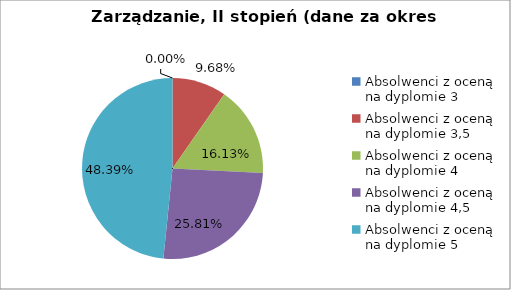
| Category | Series 0 |
|---|---|
| Absolwenci z oceną na dyplomie 3 | 0 |
| Absolwenci z oceną na dyplomie 3,5 | 9.677 |
| Absolwenci z oceną na dyplomie 4 | 16.129 |
| Absolwenci z oceną na dyplomie 4,5 | 25.806 |
| Absolwenci z oceną na dyplomie 5 | 48.387 |